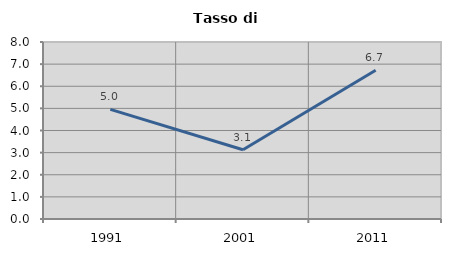
| Category | Tasso di disoccupazione   |
|---|---|
| 1991.0 | 4.952 |
| 2001.0 | 3.128 |
| 2011.0 | 6.726 |